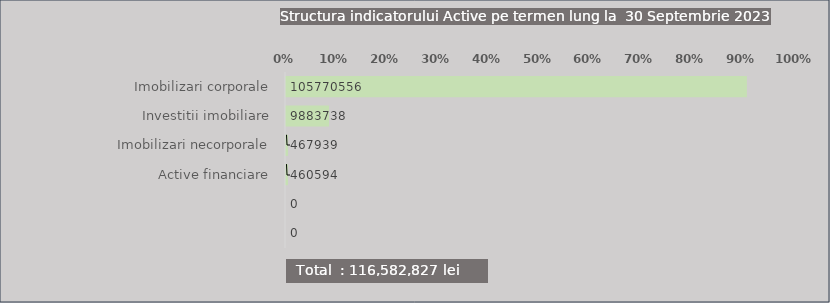
| Category | Series 0 |
|---|---|
| Imobilizari corporale | 0.907 |
| Investitii imobiliare | 0.085 |
| Imobilizari necorporale | 0.004 |
| Active financiare | 0.004 |